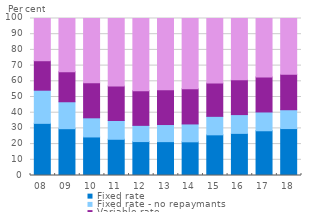
| Category | Fixed rate  | Fixed rate - no repaymants | Variable rate  | Variable rate - no repayments |
|---|---|---|---|---|
| 08 | 33.218 | 21.109 | 18.783 | 26.89 |
| 09 | 29.814 | 17.153 | 19.142 | 33.892 |
| 10 | 24.547 | 12.194 | 22.371 | 40.888 |
| 11 | 23.078 | 11.956 | 21.931 | 43.035 |
| 12 | 21.606 | 10.326 | 22.123 | 45.944 |
| 13 | 21.564 | 10.897 | 22.093 | 45.445 |
| 14 | 21.454 | 11.381 | 22.42 | 44.745 |
| 15 | 25.903 | 11.775 | 21.202 | 41.12 |
| 16 | 26.83 | 11.964 | 22.121 | 39.085 |
| 17 | 28.495 | 11.966 | 22.299 | 37.239 |
| 18 | 29.888 | 11.999 | 22.572 | 35.54 |